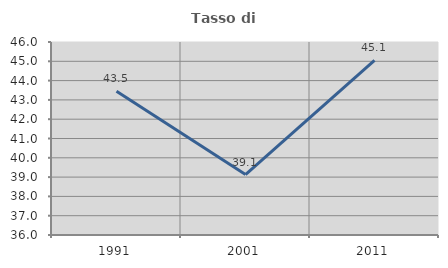
| Category | Tasso di occupazione   |
|---|---|
| 1991.0 | 43.452 |
| 2001.0 | 39.13 |
| 2011.0 | 45.052 |